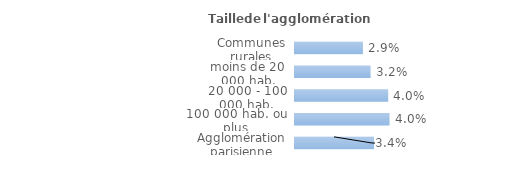
| Category | Series 0 |
|---|---|
| Communes rurales | 0.029 |
| moins de 20 000 hab. | 0.032 |
| 20 000 - 100 000 hab. | 0.04 |
| 100 000 hab. ou plus | 0.04 |
| Agglomération parisienne | 0.034 |